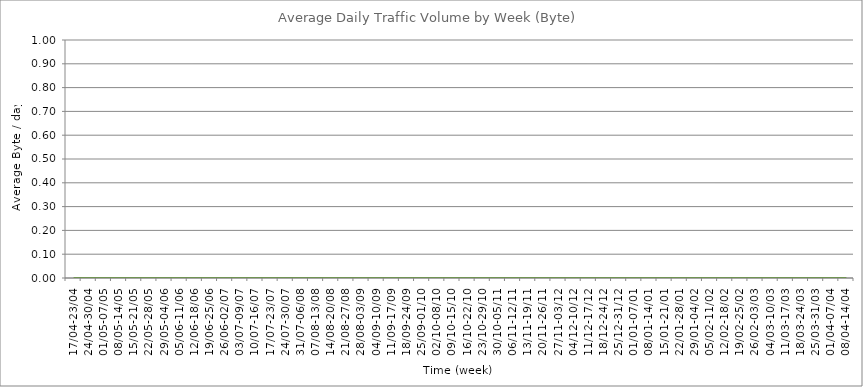
| Category | Average |
|---|---|
| 17/04-23/04 | 0 |
| 24/04-30/04 | 0 |
| 01/05-07/05 | 0 |
| 08/05-14/05 | 0 |
| 15/05-21/05 | 0 |
| 22/05-28/05 | 0 |
| 29/05-04/06 | 0 |
| 05/06-11/06 | 0 |
| 12/06-18/06 | 0 |
| 19/06-25/06 | 0 |
| 26/06-02/07 | 0 |
| 03/07-09/07 | 0 |
| 10/07-16/07 | 0 |
| 17/07-23/07 | 0 |
| 24/07-30/07 | 0 |
| 31/07-06/08 | 0 |
| 07/08-13/08 | 0 |
| 14/08-20/08 | 0 |
| 21/08-27/08 | 0 |
| 28/08-03/09 | 0 |
| 04/09-10/09 | 0 |
| 11/09-17/09 | 0 |
| 18/09-24/09 | 0 |
| 25/09-01/10 | 0 |
| 02/10-08/10 | 0 |
| 09/10-15/10 | 0 |
| 16/10-22/10 | 0 |
| 23/10-29/10 | 0 |
| 30/10-05/11 | 0 |
| 06/11-12/11 | 0 |
| 13/11-19/11 | 0 |
| 20/11-26/11 | 0 |
| 27/11-03/12 | 0 |
| 04/12-10/12 | 0 |
| 11/12-17/12 | 0 |
| 18/12-24/12 | 0 |
| 25/12-31/12 | 0 |
| 01/01-07/01 | 0 |
| 08/01-14/01 | 0 |
| 15/01-21/01 | 0 |
| 22/01-28/01 | 0 |
| 29/01-04/02 | 0 |
| 05/02-11/02 | 0 |
| 12/02-18/02 | 0 |
| 19/02-25/02 | 0 |
| 26/02-03/03 | 0 |
| 04/03-10/03 | 0 |
| 11/03-17/03 | 0 |
| 18/03-24/03 | 0 |
| 25/03-31/03 | 0 |
| 01/04-07/04 | 0 |
| 08/04-14/04 | 0 |